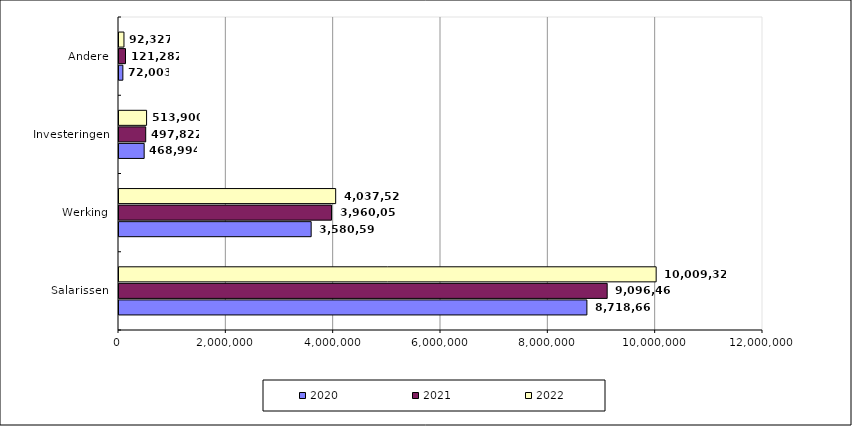
| Category | 2020 | 2021 | 2022 |
|---|---|---|---|
| Salarissen | 8718668 | 9096468 | 10009328.628 |
| Werking | 3580591.435 | 3960056.881 | 4037525.373 |
| Investeringen | 468994 | 497822 | 513900 |
| Andere | 72003 | 121282 | 92327.197 |